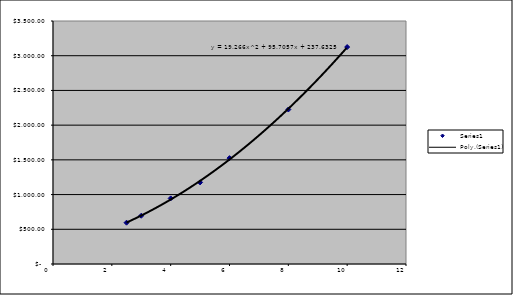
| Category | Series 0 |
|---|---|
| 2.5 | 595 |
| 3.0 | 695 |
| 4.0 | 945 |
| 5.0 | 1175 |
| 6.0 | 1525 |
| 8.0 | 2225 |
| 10.0 | 3125 |